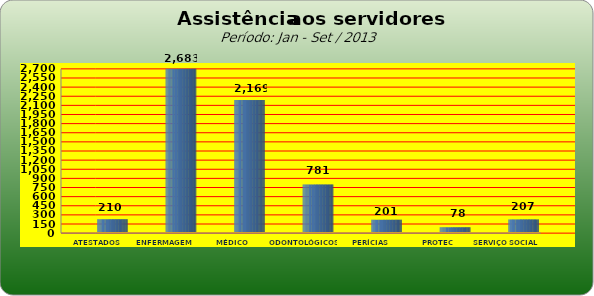
| Category | Series 0 |
|---|---|
| ATESTADOS MÉDICOS | 210 |
| ENFERMAGEM | 2683 |
| MÉDICO | 2169 |
| ODONTOLÓGICOS | 781 |
| PERÍCIAS MÉDICAS | 201 |
| PROTEC | 78 |
| SERVIÇO SOCIAL | 207 |